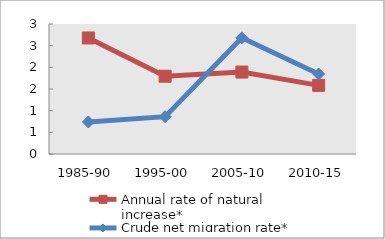
| Category | Annual rate of natural increase* | Crude net migration rate* |
|---|---|---|
| 1985-90 | 2.678 | 0.739 |
| 1995-00 | 1.795 | 0.862 |
| 2005-10 | 1.891 | 2.681 |
| 2010-15 | 1.584 | 1.847 |